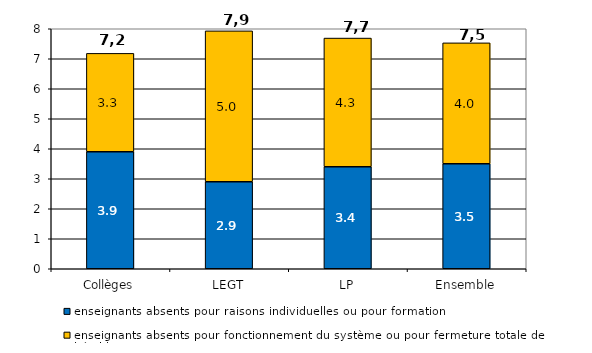
| Category | enseignants absents pour raisons individuelles ou pour formation | enseignants absents pour fonctionnement du système ou pour fermeture totale de l’établissement |
|---|---|---|
| Collèges | 3.9 | 3.28 |
| LEGT | 2.9 | 5.03 |
| LP | 3.4 | 4.29 |
| Ensemble | 3.5 | 4.03 |